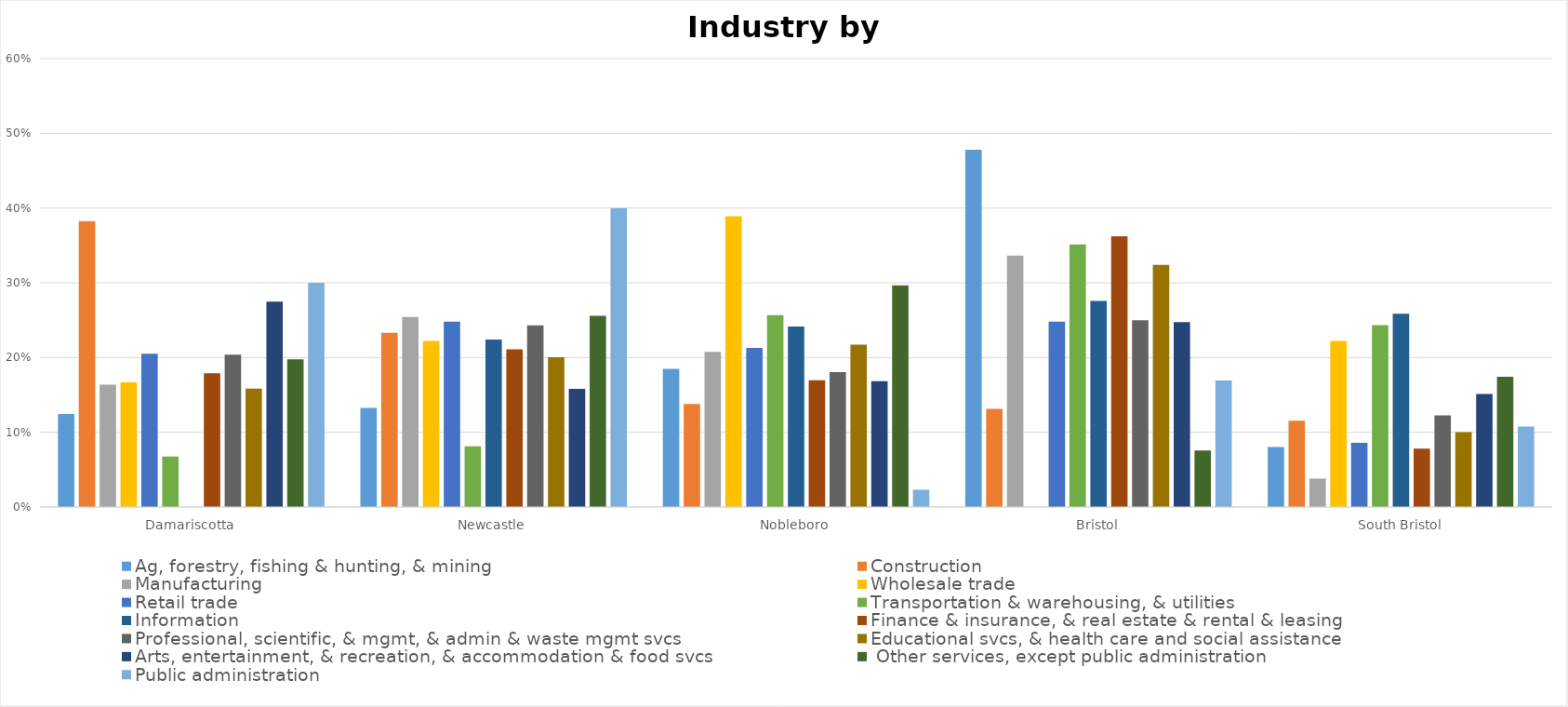
| Category | Ag, forestry, fishing & hunting, & mining | Construction | Manufacturing | Wholesale trade | Retail trade | Transportation & warehousing, & utilities | Information | Finance & insurance, & real estate & rental & leasing | Professional, scientific, & mgmt, & admin & waste mgmt svcs | Educational svcs, & health care and social assistance | Arts, entertainment, & recreation, & accommodation & food svcs |  Other services, except public administration | Public administration |
|---|---|---|---|---|---|---|---|---|---|---|---|---|---|
| Damariscotta | 0.124 | 0.382 | 0.164 | 0.167 | 0.205 | 0.068 | 0 | 0.179 | 0.204 | 0.158 | 0.275 | 0.198 | 0.3 |
| Newcastle | 0.133 | 0.233 | 0.254 | 0.222 | 0.248 | 0.081 | 0.224 | 0.211 | 0.243 | 0.2 | 0.158 | 0.256 | 0.4 |
| Nobleboro | 0.185 | 0.138 | 0.208 | 0.389 | 0.213 | 0.257 | 0.241 | 0.17 | 0.181 | 0.217 | 0.168 | 0.297 | 0.023 |
| Bristol | 0.478 | 0.131 | 0.336 | 0 | 0.248 | 0.351 | 0.276 | 0.362 | 0.25 | 0.324 | 0.247 | 0.076 | 0.169 |
| South Bristol | 0.08 | 0.115 | 0.038 | 0.222 | 0.086 | 0.243 | 0.259 | 0.078 | 0.123 | 0.1 | 0.151 | 0.174 | 0.108 |